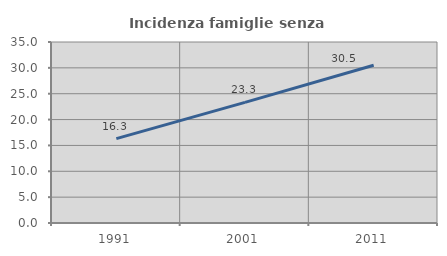
| Category | Incidenza famiglie senza nuclei |
|---|---|
| 1991.0 | 16.323 |
| 2001.0 | 23.333 |
| 2011.0 | 30.503 |